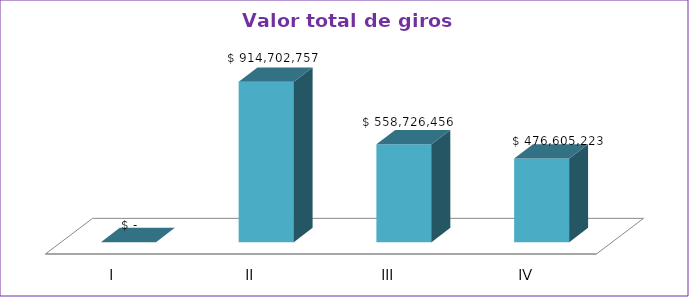
| Category | Series 0 |
|---|---|
| I | 0 |
| II | 914702757 |
| III | 558726456 |
| IV | 476605223 |